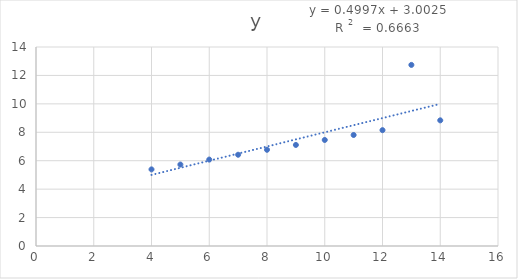
| Category | y |
|---|---|
| 10.0 | 7.46 |
| 8.0 | 6.77 |
| 13.0 | 12.74 |
| 9.0 | 7.11 |
| 11.0 | 7.81 |
| 14.0 | 8.84 |
| 6.0 | 6.08 |
| 4.0 | 5.39 |
| 12.0 | 8.15 |
| 7.0 | 6.42 |
| 5.0 | 5.73 |